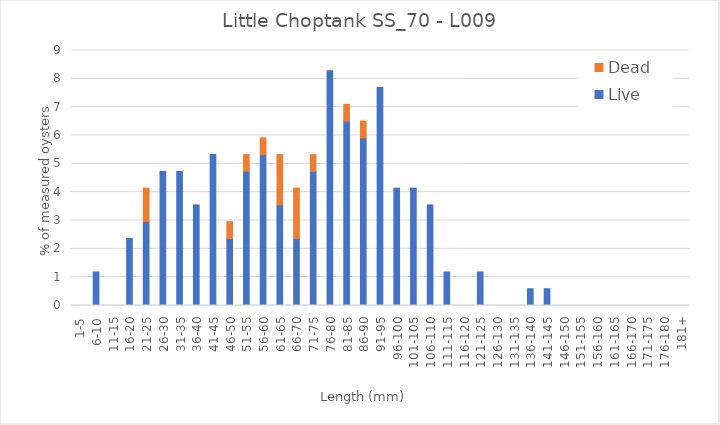
| Category | Live | Dead |
|---|---|---|
| 1-5 | 0 | 0 |
| 6-10 | 1.183 | 0 |
| 11-15 | 0 | 0 |
| 16-20 | 2.367 | 0 |
| 21-25 | 2.959 | 1.183 |
| 26-30 | 4.734 | 0 |
| 31-35 | 4.734 | 0 |
| 36-40 | 3.55 | 0 |
| 41-45 | 5.325 | 0 |
| 46-50 | 2.367 | 0.592 |
| 51-55 | 4.734 | 0.592 |
| 56-60 | 5.325 | 0.592 |
| 61-65 | 3.55 | 1.775 |
| 66-70 | 2.367 | 1.775 |
| 71-75 | 4.734 | 0.592 |
| 76-80 | 8.284 | 0 |
| 81-85 | 6.509 | 0.592 |
| 86-90 | 5.917 | 0.592 |
| 91-95 | 7.692 | 0 |
| 96-100 | 4.142 | 0 |
| 101-105 | 4.142 | 0 |
| 106-110 | 3.55 | 0 |
| 111-115 | 1.183 | 0 |
| 116-120 | 0 | 0 |
| 121-125 | 1.183 | 0 |
| 126-130 | 0 | 0 |
| 131-135 | 0 | 0 |
| 136-140 | 0.592 | 0 |
| 141-145 | 0.592 | 0 |
| 146-150 | 0 | 0 |
| 151-155 | 0 | 0 |
| 156-160 | 0 | 0 |
| 161-165 | 0 | 0 |
| 166-170 | 0 | 0 |
| 171-175 | 0 | 0 |
| 176-180 | 0 | 0 |
| 181+ | 0 | 0 |